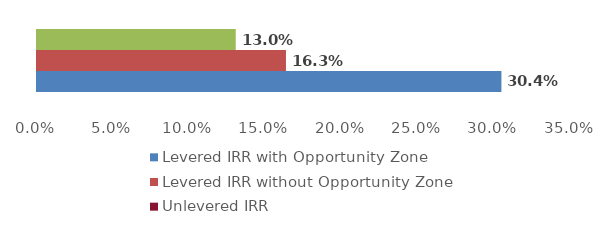
| Category | Levered IRR with Opportunity Zone | Levered IRR without Opportunity Zone | Unlevered IRR |
|---|---|---|---|
| 0 | 0.304 | 0.163 | 0.13 |